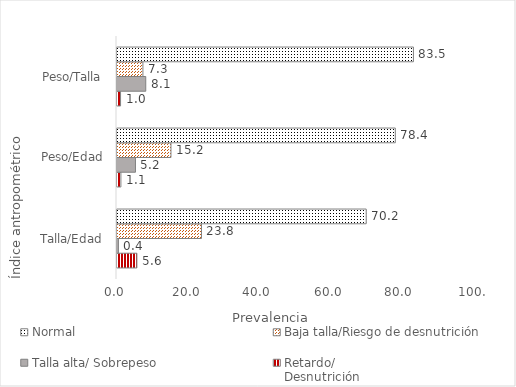
| Category | Retardo/
Desnutrición | Talla alta/ Sobrepeso  | Baja talla/Riesgo de desnutrición | Normal |
|---|---|---|---|---|
| Talla/Edad | 5.6 | 0.4 | 23.8 | 70.2 |
| Peso/Edad | 1.1 | 5.2 | 15.2 | 78.4 |
| Peso/Talla | 1 | 8.1 | 7.3 | 83.5 |